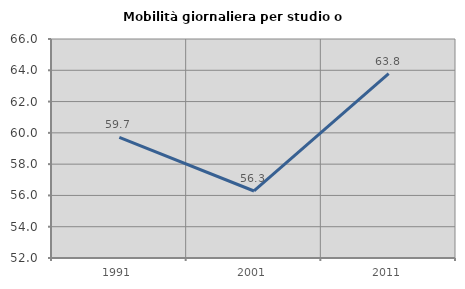
| Category | Mobilità giornaliera per studio o lavoro |
|---|---|
| 1991.0 | 59.709 |
| 2001.0 | 56.284 |
| 2011.0 | 63.793 |